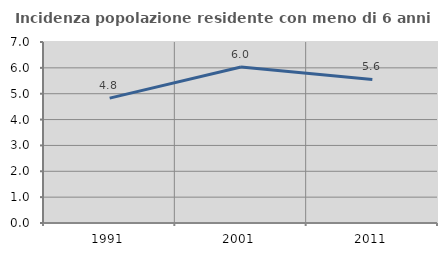
| Category | Incidenza popolazione residente con meno di 6 anni |
|---|---|
| 1991.0 | 4.828 |
| 2001.0 | 6.03 |
| 2011.0 | 5.553 |